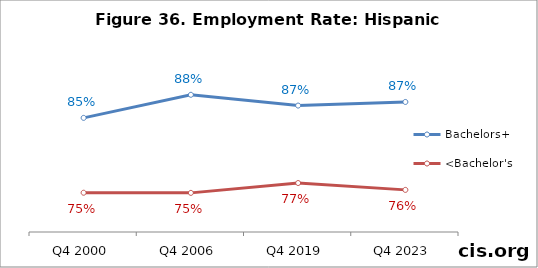
| Category | Bachelors+ | <Bachelor's |
|---|---|---|
| Q4 2000 | 0.853 | 0.753 |
| Q4 2006 | 0.883 | 0.752 |
| Q4 2019 | 0.869 | 0.765 |
| Q4 2023 | 0.874 | 0.756 |